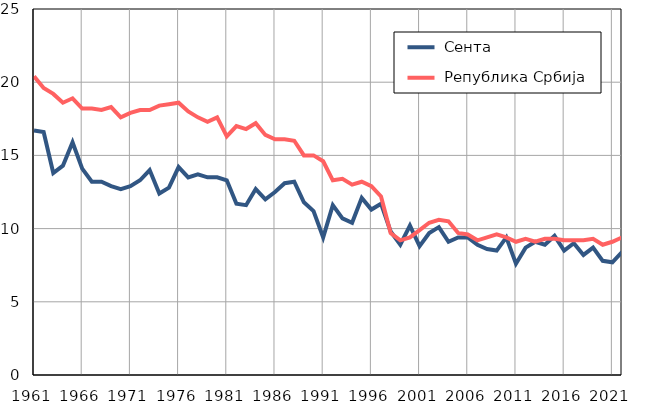
| Category |  Сента |  Република Србија |
|---|---|---|
| 1961.0 | 16.7 | 20.4 |
| 1962.0 | 16.6 | 19.6 |
| 1963.0 | 13.8 | 19.2 |
| 1964.0 | 14.3 | 18.6 |
| 1965.0 | 15.9 | 18.9 |
| 1966.0 | 14.1 | 18.2 |
| 1967.0 | 13.2 | 18.2 |
| 1968.0 | 13.2 | 18.1 |
| 1969.0 | 12.9 | 18.3 |
| 1970.0 | 12.7 | 17.6 |
| 1971.0 | 12.9 | 17.9 |
| 1972.0 | 13.3 | 18.1 |
| 1973.0 | 14 | 18.1 |
| 1974.0 | 12.4 | 18.4 |
| 1975.0 | 12.8 | 18.5 |
| 1976.0 | 14.2 | 18.6 |
| 1977.0 | 13.5 | 18 |
| 1978.0 | 13.7 | 17.6 |
| 1979.0 | 13.5 | 17.3 |
| 1980.0 | 13.5 | 17.6 |
| 1981.0 | 13.3 | 16.3 |
| 1982.0 | 11.7 | 17 |
| 1983.0 | 11.6 | 16.8 |
| 1984.0 | 12.7 | 17.2 |
| 1985.0 | 12 | 16.4 |
| 1986.0 | 12.5 | 16.1 |
| 1987.0 | 13.1 | 16.1 |
| 1988.0 | 13.2 | 16 |
| 1989.0 | 11.8 | 15 |
| 1990.0 | 11.2 | 15 |
| 1991.0 | 9.4 | 14.6 |
| 1992.0 | 11.6 | 13.3 |
| 1993.0 | 10.7 | 13.4 |
| 1994.0 | 10.4 | 13 |
| 1995.0 | 12.1 | 13.2 |
| 1996.0 | 11.3 | 12.9 |
| 1997.0 | 11.7 | 12.2 |
| 1998.0 | 9.8 | 9.7 |
| 1999.0 | 8.9 | 9.2 |
| 2000.0 | 10.2 | 9.4 |
| 2001.0 | 8.8 | 9.9 |
| 2002.0 | 9.7 | 10.4 |
| 2003.0 | 10.1 | 10.6 |
| 2004.0 | 9.1 | 10.5 |
| 2005.0 | 9.4 | 9.7 |
| 2006.0 | 9.4 | 9.6 |
| 2007.0 | 8.9 | 9.2 |
| 2008.0 | 8.6 | 9.4 |
| 2009.0 | 8.5 | 9.6 |
| 2010.0 | 9.4 | 9.4 |
| 2011.0 | 7.6 | 9.1 |
| 2012.0 | 8.7 | 9.3 |
| 2013.0 | 9.1 | 9.1 |
| 2014.0 | 8.9 | 9.3 |
| 2015.0 | 9.5 | 9.3 |
| 2016.0 | 8.5 | 9.2 |
| 2017.0 | 9 | 9.2 |
| 2018.0 | 8.2 | 9.2 |
| 2019.0 | 8.7 | 9.3 |
| 2020.0 | 7.8 | 8.9 |
| 2021.0 | 7.7 | 9.1 |
| 2022.0 | 8.4 | 9.4 |